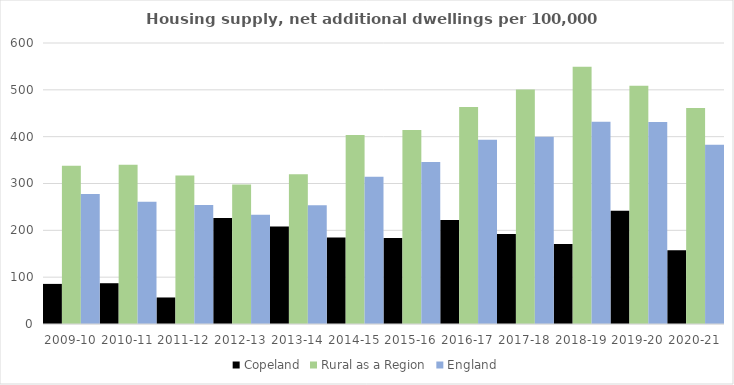
| Category | Copeland | Rural as a Region | England |
|---|---|---|---|
| 2009-10 | 85.619 | 337.852 | 277.548 |
| 2010-11 | 87.075 | 340.105 | 260.994 |
| 2011-12 | 56.636 | 317.04 | 254.007 |
| 2012-13 | 226.145 | 297.763 | 233.153 |
| 2013-14 | 208.417 | 319.835 | 253.602 |
| 2014-15 | 184.639 | 403.796 | 314.256 |
| 2015-16 | 183.676 | 414.091 | 346.154 |
| 2016-17 | 222.203 | 463.209 | 393.256 |
| 2017-18 | 192.171 | 500.68 | 399.646 |
| 2018-19 | 170.993 | 549.491 | 432.099 |
| 2019-20 | 241.996 | 508.493 | 431.187 |
| 2020-21 | 157.258 | 461.114 | 382.827 |